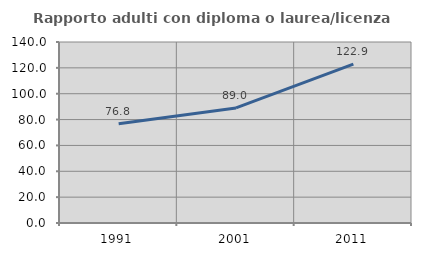
| Category | Rapporto adulti con diploma o laurea/licenza media  |
|---|---|
| 1991.0 | 76.81 |
| 2001.0 | 89.02 |
| 2011.0 | 122.864 |